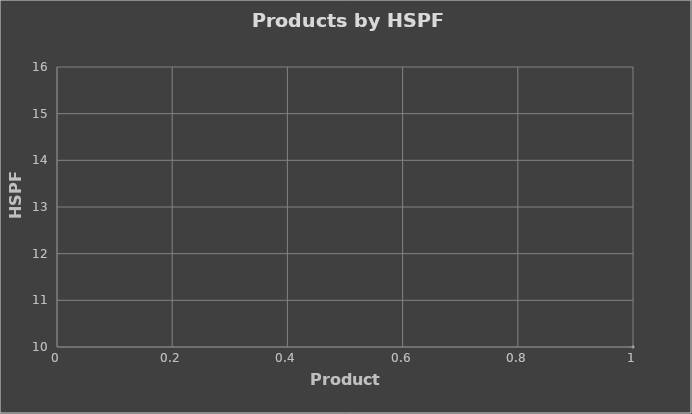
| Category | Series 0 |
|---|---|
| 0 | 10 |
| 1 | 10 |
| 2 | 10 |
| 3 | 10 |
| 4 | 10 |
| 5 | 10 |
| 6 | 10 |
| 7 | 10 |
| 8 | 10 |
| 9 | 10 |
| 10 | 10 |
| 11 | 10 |
| 12 | 10 |
| 13 | 10 |
| 14 | 10 |
| 15 | 10 |
| 16 | 10 |
| 17 | 10 |
| 18 | 10 |
| 19 | 10 |
| 20 | 10 |
| 21 | 10 |
| 22 | 10 |
| 23 | 10 |
| 24 | 10 |
| 25 | 15 |
| 26 | 14 |
| 27 | 12 |
| 28 | 12 |
| 29 | 10 |
| 30 | 10 |
| 31 | 11 |
| 32 | 11.3 |
| 33 | 10.7 |
| 34 | 11 |
| 35 | 10.5 |
| 36 | 10.5 |
| 37 | 11.5 |
| 38 | 11 |
| 39 | 11.7 |
| 40 | 11.4 |
| 41 | 10 |
| 42 | 10 |
| 43 | 10.4 |
| 44 | 11 |
| 45 | 13 |
| 46 | 12 |
| 47 | 11.6 |
| 48 | 11.3 |
| 49 | 13.5 |
| 50 | 12.5 |
| 51 | 13.5 |
| 52 | 12.5 |
| 53 | 12.5 |
| 54 | 11.5 |
| 55 | 12 |
| 56 | 11 |
| 57 | 12 |
| 58 | 11 |
| 59 | 12.8 |
| 60 | 12.5 |
| 61 | 11.7 |
| 62 | 11.2 |
| 63 | 10 |
| 64 | 11.2 |
| 65 | 10.4 |
| 66 | 10 |
| 67 | 12 |
| 68 | 14.5 |
| 69 | 13.6 |
| 70 | 10.5 |
| 71 | 11 |
| 72 | 10.5 |
| 73 | 10.5 |
| 74 | 10 |
| 75 | 10 |
| 76 | 10 |
| 77 | 10 |
| 78 | 12 |
| 79 | 10.5 |
| 80 | 10.5 |
| 81 | 10.5 |
| 82 | 10.5 |
| 83 | 10.5 |
| 84 | 11 |
| 85 | 11 |
| 86 | 11 |
| 87 | 11 |
| 88 | 11 |
| 89 | 11.5 |
| 90 | 11.5 |
| 91 | 11 |
| 92 | 11.5 |
| 93 | 11.5 |
| 94 | 10 |
| 95 | 10 |
| 96 | 10 |
| 97 | 10.5 |
| 98 | 10.5 |
| 99 | 10.5 |
| 100 | 10.5 |
| 101 | 10.5 |
| 102 | 10.5 |
| 103 | 11 |
| 104 | 11 |
| 105 | 11 |
| 106 | 10.5 |
| 107 | 10.5 |
| 108 | 10.5 |
| 109 | 10.5 |
| 110 | 10.5 |
| 111 | 11 |
| 112 | 11 |
| 113 | 11 |
| 114 | 11 |
| 115 | 11 |
| 116 | 11 |
| 117 | 11 |
| 118 | 11 |
| 119 | 11 |
| 120 | 11 |
| 121 | 11 |
| 122 | 11 |
| 123 | 11 |
| 124 | 11 |
| 125 | 11 |
| 126 | 11 |
| 127 | 11.5 |
| 128 | 11.5 |
| 129 | 11.5 |
| 130 | 11.5 |
| 131 | 11.5 |
| 132 | 11.5 |
| 133 | 11.5 |
| 134 | 11.5 |
| 135 | 11.5 |
| 136 | 11.5 |
| 137 | 11.5 |
| 138 | 11.5 |
| 139 | 10.5 |
| 140 | 10.5 |
| 141 | 10.5 |
| 142 | 10.5 |
| 143 | 10.5 |
| 144 | 10.5 |
| 145 | 11 |
| 146 | 11 |
| 147 | 11 |
| 148 | 11 |
| 149 | 11 |
| 150 | 11 |
| 151 | 10.5 |
| 152 | 10.5 |
| 153 | 10.5 |
| 154 | 10.5 |
| 155 | 11 |
| 156 | 11 |
| 157 | 11 |
| 158 | 11 |
| 159 | 11 |
| 160 | 11 |
| 161 | 11 |
| 162 | 13 |
| 163 | 10.5 |
| 164 | 10.5 |
| 165 | 11.5 |
| 166 | 11 |
| 167 | 11.5 |
| 168 | 11.5 |
| 169 | 11.5 |
| 170 | 11.5 |
| 171 | 11 |
| 172 | 11 |
| 173 | 11 |
| 174 | 10.5 |
| 175 | 10.5 |
| 176 | 11 |
| 177 | 11 |
| 178 | 11 |
| 179 | 11 |
| 180 | 11 |
| 181 | 11.5 |
| 182 | 10.5 |
| 183 | 10.5 |
| 184 | 10.5 |
| 185 | 10.5 |
| 186 | 11 |
| 187 | 11 |
| 188 | 10.5 |
| 189 | 11 |
| 190 | 11 |
| 191 | 11 |
| 192 | 11.5 |
| 193 | 11.5 |
| 194 | 11.5 |
| 195 | 11.5 |
| 196 | 11.5 |
| 197 | 11 |
| 198 | 11.5 |
| 199 | 11.5 |
| 200 | 11 |
| 201 | 11.5 |
| 202 | 11.5 |
| 203 | 10.5 |
| 204 | 10.5 |
| 205 | 11 |
| 206 | 11 |
| 207 | 11 |
| 208 | 11 |
| 209 | 11 |
| 210 | 11 |
| 211 | 10.5 |
| 212 | 11 |
| 213 | 11 |
| 214 | 10.5 |
| 215 | 10.5 |
| 216 | 10.5 |
| 217 | 11 |
| 218 | 11 |
| 219 | 10.5 |
| 220 | 11 |
| 221 | 11 |
| 222 | 11 |
| 223 | 11.5 |
| 224 | 11.5 |
| 225 | 12 |
| 226 | 11 |
| 227 | 10.5 |
| 228 | 11 |
| 229 | 11 |
| 230 | 10.5 |
| 231 | 10.5 |
| 232 | 10.5 |
| 233 | 12 |
| 234 | 15 |
| 235 | 14 |
| 236 | 10.3 |
| 237 | 10.3 |
| 238 | 10.5 |
| 239 | 10.5 |
| 240 | 10.2 |
| 241 | 10.2 |
| 242 | 10 |
| 243 | 10 |
| 244 | 10 |
| 245 | 10 |
| 246 | 10.5 |
| 247 | 10.5 |
| 248 | 12 |
| 249 | 10.5 |
| 250 | 10.5 |
| 251 | 10.5 |
| 252 | 10.5 |
| 253 | 10.5 |
| 254 | 11 |
| 255 | 11 |
| 256 | 11 |
| 257 | 11 |
| 258 | 11 |
| 259 | 11.5 |
| 260 | 11.5 |
| 261 | 11 |
| 262 | 11.5 |
| 263 | 11.5 |
| 264 | 10 |
| 265 | 10 |
| 266 | 10 |
| 267 | 10.5 |
| 268 | 10.5 |
| 269 | 10.5 |
| 270 | 10.5 |
| 271 | 10.5 |
| 272 | 10.5 |
| 273 | 11 |
| 274 | 11 |
| 275 | 11 |
| 276 | 10.5 |
| 277 | 10.5 |
| 278 | 10.5 |
| 279 | 10.5 |
| 280 | 10.5 |
| 281 | 11 |
| 282 | 11 |
| 283 | 11 |
| 284 | 11 |
| 285 | 11 |
| 286 | 11 |
| 287 | 11 |
| 288 | 11 |
| 289 | 11 |
| 290 | 11 |
| 291 | 11 |
| 292 | 11 |
| 293 | 11 |
| 294 | 11 |
| 295 | 11 |
| 296 | 11 |
| 297 | 11.5 |
| 298 | 11.5 |
| 299 | 11.5 |
| 300 | 11.5 |
| 301 | 11.5 |
| 302 | 11.5 |
| 303 | 11.5 |
| 304 | 11.5 |
| 305 | 11.5 |
| 306 | 11.5 |
| 307 | 11.5 |
| 308 | 11.5 |
| 309 | 10.5 |
| 310 | 10.5 |
| 311 | 10.5 |
| 312 | 10.5 |
| 313 | 10.5 |
| 314 | 10.5 |
| 315 | 11 |
| 316 | 11 |
| 317 | 11 |
| 318 | 11 |
| 319 | 11 |
| 320 | 11 |
| 321 | 10.5 |
| 322 | 10.5 |
| 323 | 10.5 |
| 324 | 10.5 |
| 325 | 11 |
| 326 | 11 |
| 327 | 11 |
| 328 | 11 |
| 329 | 11 |
| 330 | 11 |
| 331 | 11 |
| 332 | 11 |
| 333 | 13 |
| 334 | 10.5 |
| 335 | 10.5 |
| 336 | 11.5 |
| 337 | 11 |
| 338 | 11.5 |
| 339 | 11.5 |
| 340 | 11.5 |
| 341 | 11.5 |
| 342 | 11 |
| 343 | 11 |
| 344 | 11 |
| 345 | 10.5 |
| 346 | 10.5 |
| 347 | 11 |
| 348 | 11 |
| 349 | 11 |
| 350 | 11 |
| 351 | 11 |
| 352 | 11.5 |
| 353 | 10.5 |
| 354 | 10.5 |
| 355 | 10.5 |
| 356 | 10.5 |
| 357 | 11 |
| 358 | 11 |
| 359 | 10.5 |
| 360 | 11 |
| 361 | 11 |
| 362 | 11 |
| 363 | 11.5 |
| 364 | 11.5 |
| 365 | 11.5 |
| 366 | 11.5 |
| 367 | 11.5 |
| 368 | 11 |
| 369 | 11.5 |
| 370 | 11.5 |
| 371 | 11 |
| 372 | 11.5 |
| 373 | 11.5 |
| 374 | 10.5 |
| 375 | 10.5 |
| 376 | 11 |
| 377 | 11 |
| 378 | 11 |
| 379 | 11 |
| 380 | 11 |
| 381 | 11 |
| 382 | 10.5 |
| 383 | 11 |
| 384 | 11 |
| 385 | 10.5 |
| 386 | 10.5 |
| 387 | 10.5 |
| 388 | 11 |
| 389 | 11 |
| 390 | 10.5 |
| 391 | 11 |
| 392 | 11 |
| 393 | 11 |
| 394 | 11.5 |
| 395 | 11.5 |
| 396 | 12 |
| 397 | 11 |
| 398 | 10.5 |
| 399 | 11 |
| 400 | 11 |
| 401 | 10.5 |
| 402 | 10.5 |
| 403 | 10.5 |
| 404 | 12 |
| 405 | 12 |
| 406 | 12 |
| 407 | 12 |
| 408 | 12 |
| 409 | 11 |
| 410 | 11 |
| 411 | 11 |
| 412 | 11 |
| 413 | 12 |
| 414 | 12 |
| 415 | 12 |
| 416 | 12 |
| 417 | 12.5 |
| 418 | 12.5 |
| 419 | 12.5 |
| 420 | 12.5 |
| 421 | 10.3 |
| 422 | 12 |
| 423 | 11.2 |
| 424 | 10.5 |
| 425 | 10.5 |
| 426 | 10.5 |
| 427 | 10.5 |
| 428 | 10.5 |
| 429 | 15 |
| 430 | 14 |
| 431 | 12 |
| 432 | 13 |
| 433 | 12.5 |
| 434 | 13 |
| 435 | 10.3 |
| 436 | 10.3 |
| 437 | 10.3 |
| 438 | 11.2 |
| 439 | 12 |
| 440 | 10.3 |
| 441 | 10.5 |
| 442 | 12 |
| 443 | 14.5 |
| 444 | 13.6 |
| 445 | 10.5 |
| 446 | 11 |
| 447 | 10.1 |
| 448 | 11 |
| 449 | 11.7 |
| 450 | 11.2 |
| 451 | 12.5 |
| 452 | 12.5 |
| 453 | 10 |
| 454 | 10.3 |
| 455 | 10.3 |
| 456 | 10.7 |
| 457 | 12.5 |
| 458 | 10.3 |
| 459 | 12.5 |
| 460 | 10 |
| 461 | 10 |
| 462 | 10 |
| 463 | 10 |
| 464 | 10 |
| 465 | 11 |
| 466 | 10.55 |
| 467 | 10 |
| 468 | 12.5 |
| 469 | 12.5 |
| 470 | 11.6 |
| 471 | 11 |
| 472 | 10.6 |
| 473 | 12.5 |
| 474 | 11.3 |
| 475 | 12 |
| 476 | 11.7 |
| 477 | 12.5 |
| 478 | 11.7 |
| 479 | 11.2 |
| 480 | 11 |
| 481 | 10.1 |
| 482 | 12 |
| 483 | 14.5 |
| 484 | 13.6 |
| 485 | 10.5 |
| 486 | 11 |
| 487 | 10.5 |
| 488 | 11.2 |
| 489 | 10 |
| 490 | 10 |
| 491 | 10.5 |
| 492 | 10.1 |
| 493 | 10 |